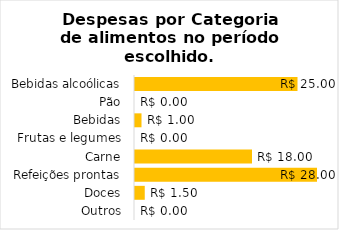
| Category | Despesas |
|---|---|
| Bebidas alcoólicas | 25 |
| Pão | 0 |
| Bebidas | 1 |
| Frutas e legumes | 0 |
| Carne | 18 |
| Refeições prontas | 28 |
| Doces | 1.5 |
| Outros | 0 |